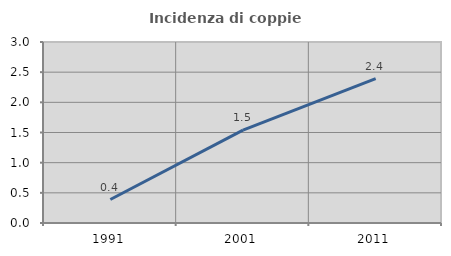
| Category | Incidenza di coppie miste |
|---|---|
| 1991.0 | 0.389 |
| 2001.0 | 1.538 |
| 2011.0 | 2.393 |